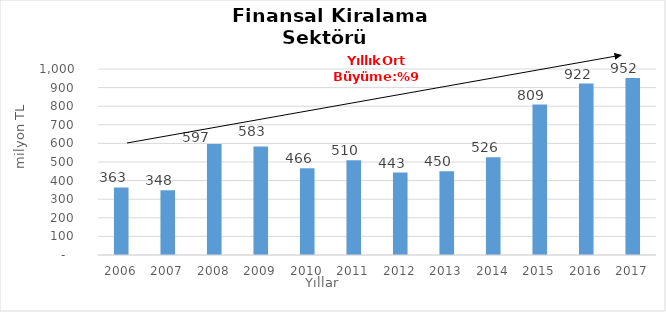
| Category | Finansal Kiralama  |
|---|---|
| 2006.0 | 363.206 |
| 2007.0 | 348.066 |
| 2008.0 | 596.686 |
| 2009.0 | 582.74 |
| 2010.0 | 466.416 |
| 2011.0 | 509.999 |
| 2012.0 | 443.41 |
| 2013.0 | 450.17 |
| 2014.0 | 525.856 |
| 2015.0 | 809 |
| 2016.0 | 922 |
| 2017.0 | 952 |